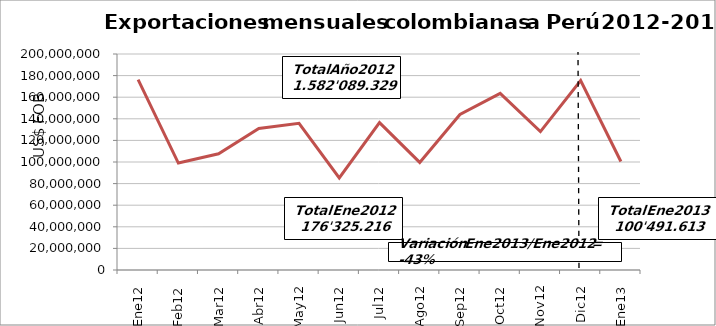
| Category | Series 0 |
|---|---|
| 0 | 176325216 |
| 1 | 99028190 |
| 2 | 107623856 |
| 3 | 130984153 |
| 4 | 135768825 |
| 5 | 85300304 |
| 6 | 136433216 |
| 7 | 99592347 |
| 8 | 143978368 |
| 9 | 163509167 |
| 10 | 128099489 |
| 11 | 175446198 |
| 12 | 100491613.05 |